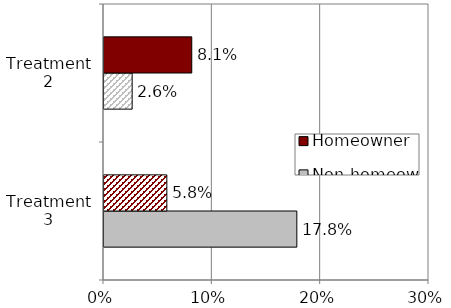
| Category | Non-homeowner | Homeowner |
|---|---|---|
| Treatment 3 | 0.178 | 0.058 |
| Treatment 2 | 0.026 | 0.081 |